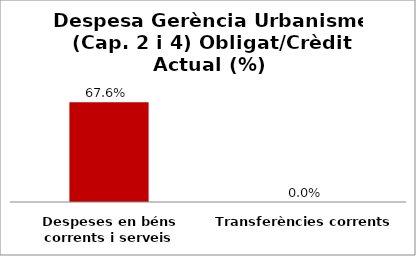
| Category | Series 0 |
|---|---|
| Despeses en béns corrents i serveis | 0.676 |
| Transferències corrents | 0 |